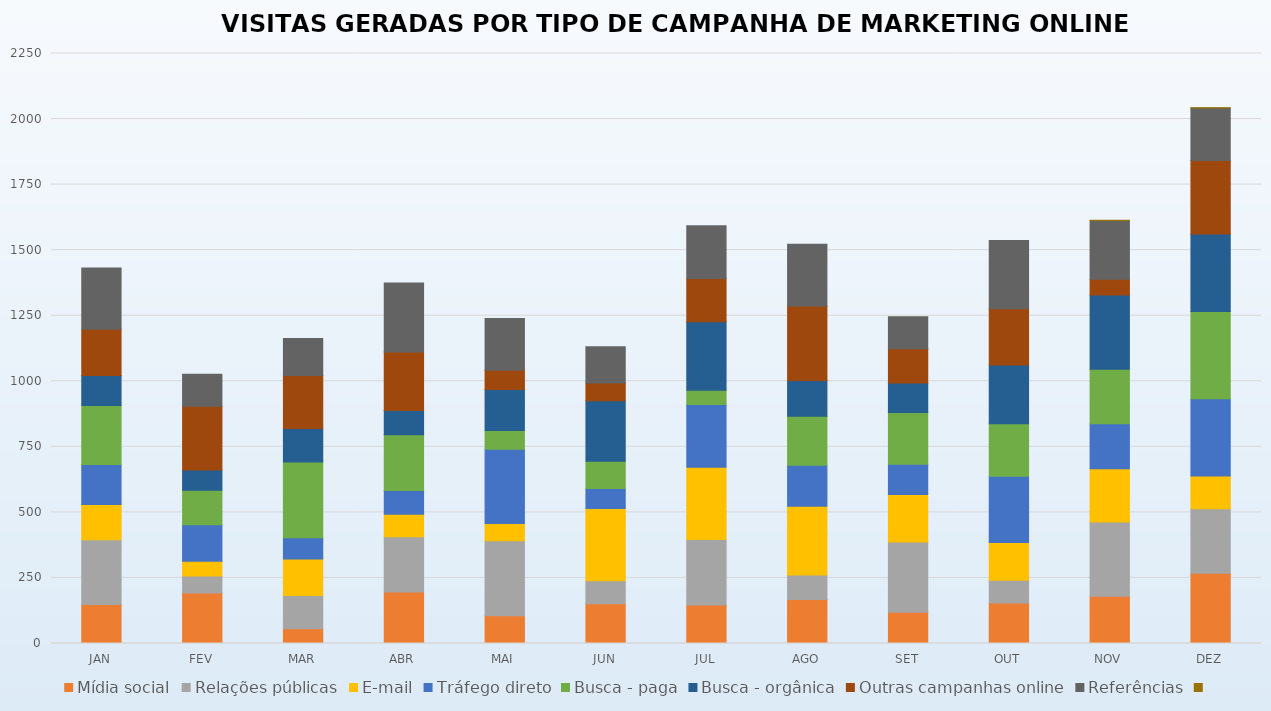
| Category | Mídia social | Relações públicas | E-mail | Tráfego direto | Busca - paga | Busca - orgânica | Outras campanhas online | Referências | Series 9 |
|---|---|---|---|---|---|---|---|---|---|
| JAN | 149 | 247 | 134 | 153 | 225 | 114 | 176 | 234 | 0 |
| FEV | 193 | 64 | 57 | 139 | 131 | 78 | 243 | 122 | 0 |
| MAR | 56 | 127 | 139 | 81 | 289 | 128 | 202 | 141 | 0 |
| ABR | 196 | 211 | 86 | 90 | 213 | 93 | 223 | 263 | 0 |
| MAI | 106 | 286 | 66 | 283 | 71 | 157 | 73 | 197 | 0 |
| JUN | 152 | 87 | 276 | 76 | 104 | 231 | 67 | 139 | 0 |
| JUL | 147 | 250 | 275 | 239 | 55 | 261 | 165 | 201 | 0 |
| AGO | 168 | 93 | 262 | 157 | 187 | 136 | 284 | 236 | 0 |
| SET | 119 | 268 | 181 | 116 | 197 | 112 | 131 | 122 | 0 |
| OUT | 154 | 87 | 144 | 253 | 200 | 224 | 215 | 260 | 0 |
| NOV | 180 | 283 | 203 | 172 | 208 | 283 | 60 | 224 | 1 |
| DEZ | 268 | 246 | 125 | 294 | 333 | 296 | 280 | 200 | 1 |